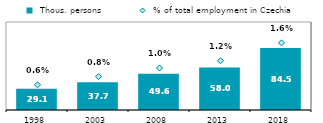
| Category |  Thous. persons |
|---|---|
| 1998.0 | 29.124 |
| 2003.0 | 37.749 |
| 2008.0 | 49.6 |
| 2013.0 | 57.996 |
| 2018.0 | 84.531 |